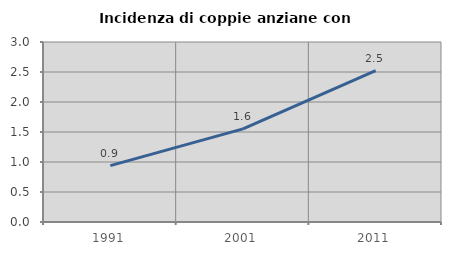
| Category | Incidenza di coppie anziane con figli |
|---|---|
| 1991.0 | 0.94 |
| 2001.0 | 1.552 |
| 2011.0 | 2.522 |